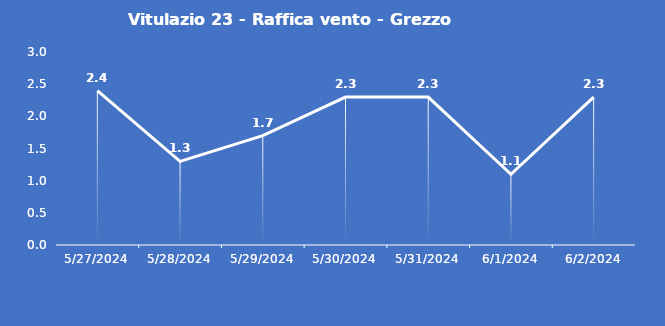
| Category | Vitulazio 23 - Raffica vento - Grezzo (m/s) |
|---|---|
| 5/27/24 | 2.4 |
| 5/28/24 | 1.3 |
| 5/29/24 | 1.7 |
| 5/30/24 | 2.3 |
| 5/31/24 | 2.3 |
| 6/1/24 | 1.1 |
| 6/2/24 | 2.3 |